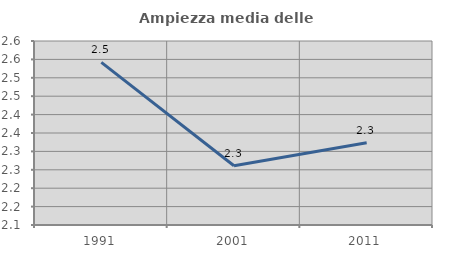
| Category | Ampiezza media delle famiglie |
|---|---|
| 1991.0 | 2.542 |
| 2001.0 | 2.261 |
| 2011.0 | 2.324 |